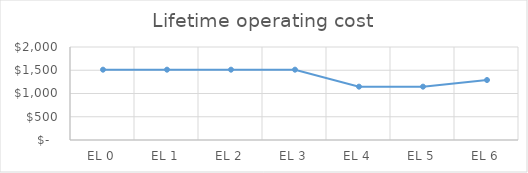
| Category |           Lifetime operating cost |
|---|---|
| EL 0 | 1512.306 |
| EL 1 | 1512.306 |
| EL 2 | 1512.306 |
| EL 3 | 1512.306 |
| EL 4 | 1147.214 |
| EL 5 | 1147.214 |
| EL 6 | 1289.941 |